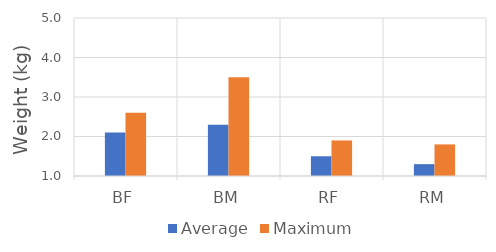
| Category | Average | Maximum |
|---|---|---|
| BF | 2.1 | 2.6 |
| BM | 2.3 | 3.5 |
| RF | 1.5 | 1.9 |
| RM | 1.3 | 1.8 |